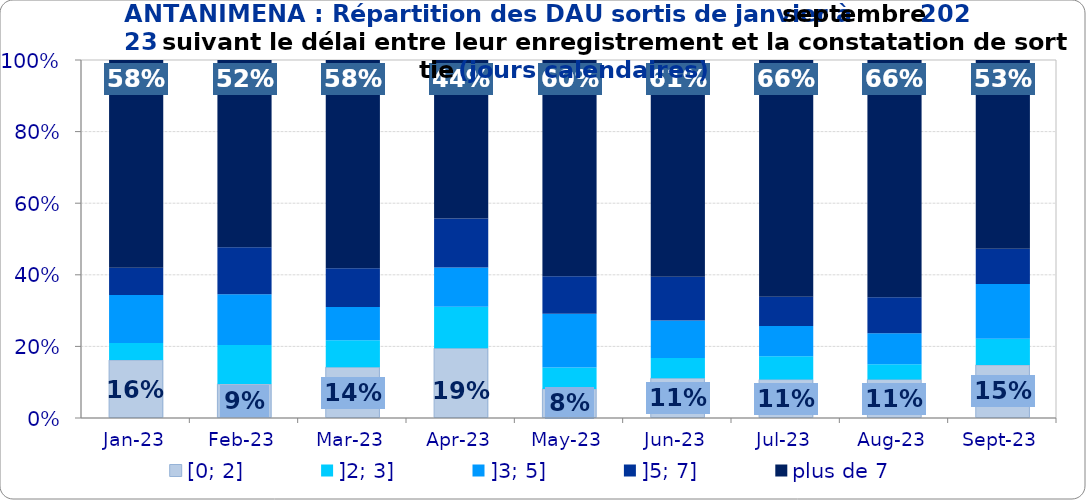
| Category | [0; 2] | ]2; 3] | ]3; 5] | ]5; 7] | plus de 7 |
|---|---|---|---|---|---|
| 2023-01-01 | 0.162 | 0.048 | 0.134 | 0.076 | 0.58 |
| 2023-02-01 | 0.095 | 0.109 | 0.142 | 0.131 | 0.523 |
| 2023-03-01 | 0.142 | 0.075 | 0.093 | 0.109 | 0.581 |
| 2023-04-01 | 0.195 | 0.116 | 0.109 | 0.137 | 0.442 |
| 2023-05-01 | 0.081 | 0.06 | 0.15 | 0.105 | 0.604 |
| 2023-06-01 | 0.111 | 0.057 | 0.104 | 0.123 | 0.605 |
| 2023-07-01 | 0.107 | 0.065 | 0.084 | 0.082 | 0.661 |
| 2023-08-01 | 0.107 | 0.042 | 0.087 | 0.101 | 0.662 |
| 2023-09-01 | 0.148 | 0.073 | 0.153 | 0.098 | 0.527 |